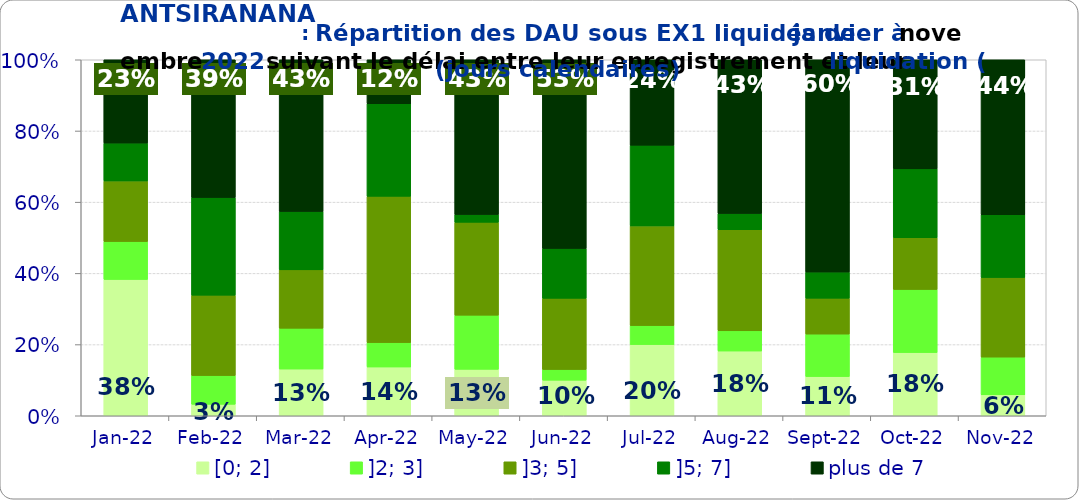
| Category | [0; 2] | ]2; 3] | ]3; 5] | ]5; 7] | plus de 7 |
|---|---|---|---|---|---|
| 2022-01-01 | 0.383 | 0.106 | 0.17 | 0.106 | 0.234 |
| 2022-02-01 | 0.032 | 0.081 | 0.226 | 0.274 | 0.387 |
| 2022-03-01 | 0.131 | 0.115 | 0.164 | 0.164 | 0.426 |
| 2022-04-01 | 0.137 | 0.068 | 0.411 | 0.26 | 0.123 |
| 2022-05-01 | 0.13 | 0.152 | 0.261 | 0.022 | 0.435 |
| 2022-06-01 | 0.1 | 0.03 | 0.2 | 0.14 | 0.53 |
| 2022-07-01 | 0.2 | 0.053 | 0.28 | 0.227 | 0.24 |
| 2022-08-01 | 0.182 | 0.057 | 0.284 | 0.045 | 0.432 |
| 2022-09-01 | 0.11 | 0.119 | 0.101 | 0.073 | 0.596 |
| 2022-10-01 | 0.177 | 0.177 | 0.145 | 0.194 | 0.306 |
| 2022-11-01 | 0.059 | 0.106 | 0.224 | 0.176 | 0.435 |